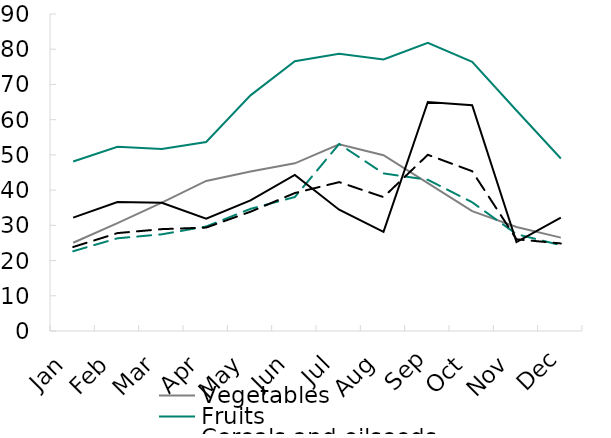
| Category | Vegetables | Fruits | Cereals and oilseeds | Growing grapes | Total Agriculture |
|---|---|---|---|---|---|
| Jan | 25.065 | 48.129 | 22.645 | 32.194 | 23.852 |
| Feb | 30.643 | 52.286 | 26.321 | 36.607 | 27.794 |
| Mar | 36.452 | 51.677 | 27.452 | 36.387 | 28.92 |
| Apr | 42.6 | 53.667 | 29.667 | 31.867 | 29.361 |
| May | 45.29 | 66.903 | 34.677 | 37.097 | 33.864 |
| Jun | 47.6 | 76.6 | 38.033 | 44.333 | 39.169 |
| Jul | 53 | 78.742 | 53.097 | 34.419 | 42.272 |
| Aug | 49.903 | 77.097 | 44.742 | 28.161 | 38.013 |
| Sep | 41.967 | 81.833 | 42.933 | 65.033 | 50.024 |
| Oct | 34.032 | 76.419 | 36.548 | 64.097 | 45.371 |
| Nov | 29.533 | 62.6 | 27.5 | 25.233 | 26.041 |
| Dec | 26.516 | 48.968 | 24.355 | 32.194 | 24.855 |